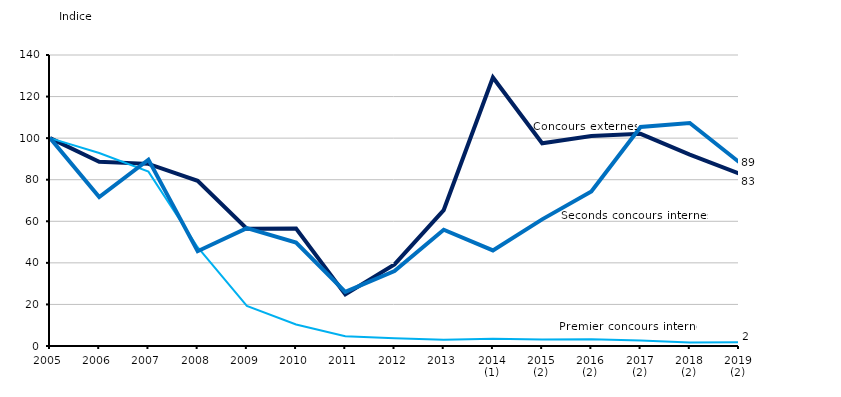
| Category | Concours externes  | Premier concours interne | Seconds concours internes |
|---|---|---|---|
| 2005 | 100 | 100 | 100 |
| 2006 | 88.613 | 92.877 | 71.648 |
| 2007 | 87.624 | 83.879 | 89.655 |
| 2008 | 79.501 | 47.546 | 45.594 |
| 2009 | 56.405 | 19.291 | 56.705 |
| 2010 | 56.526 | 10.327 | 49.808 |
| 2011 | 24.817 | 4.703 | 26.054 |
| 2012 | 39.268 | 3.681 | 36.015 |
| 2013 | 65.396 | 2.965 | 55.939 |
| 2014 (1) | 129.176 | 3.545 | 45.977 |
| 2015 (2) | 97.523 | 3.067 | 60.92 |
| 2016 (2) | 101.07 | 3.306 | 74.33 |
| 2017 (2) | 102.059 | 2.59 | 105.364 |
| 2018 (2) | 92.095 | 1.704 | 107.28 |
| 2019 (2) | 83 | 1.772 | 88.506 |